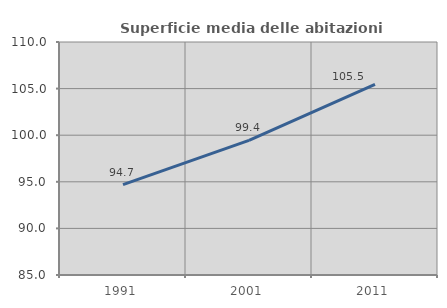
| Category | Superficie media delle abitazioni occupate |
|---|---|
| 1991.0 | 94.697 |
| 2001.0 | 99.442 |
| 2011.0 | 105.464 |